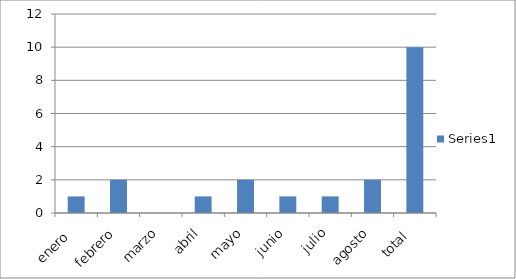
| Category | Series 0 |
|---|---|
| enero  | 1 |
| febrero | 2 |
| marzo | 0 |
| abril | 1 |
| mayo | 2 |
| junio | 1 |
| julio | 1 |
| agosto | 2 |
| total  | 10 |